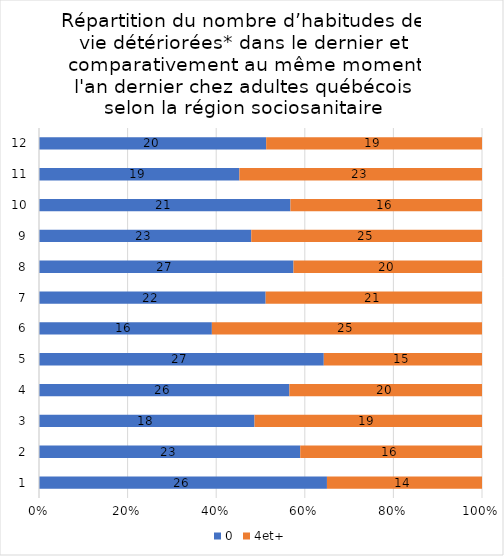
| Category | 0 | 4et+ |
|---|---|---|
| 0 | 26 | 14 |
| 1 | 23 | 16 |
| 2 | 18 | 19 |
| 3 | 26 | 20 |
| 4 | 27 | 15 |
| 5 | 16 | 25 |
| 6 | 22 | 21 |
| 7 | 27 | 20 |
| 8 | 23 | 25 |
| 9 | 21 | 16 |
| 10 | 19 | 23 |
| 11 | 20 | 19 |